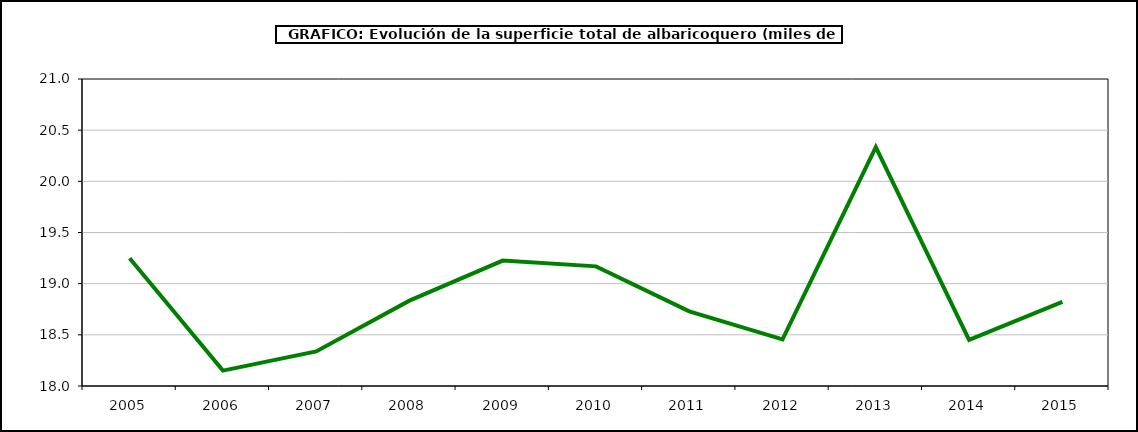
| Category | superficie albaricoquero |
|---|---|
| 2005.0 | 19.249 |
| 2006.0 | 18.15 |
| 2007.0 | 18.338 |
| 2008.0 | 18.834 |
| 2009.0 | 19.226 |
| 2010.0 | 19.169 |
| 2011.0 | 18.729 |
| 2012.0 | 18.455 |
| 2013.0 | 20.334 |
| 2014.0 | 18.451 |
| 2015.0 | 18.822 |